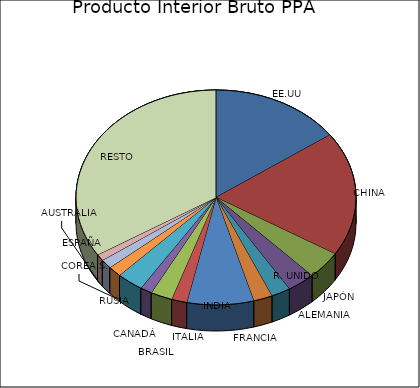
| Category | Series 0 |
|---|---|
| EE.UU | 20413 |
| CHINA | 25239 |
| JAPÓN | 5619 |
| ALEMANIA | 4374 |
| R. UNIDO | 3029 |
| FRANCIA | 2960 |
| INDIA | 10385 |
| ITALIA | 2400 |
| BRASIL | 3389 |
| CANADÁ | 1847 |
| RUSIA | 4169 |
| COREA S. | 2138 |
| ESPAÑA | 1864 |
| AUSTRALIA | 1313 |
| RESTO | 45838 |